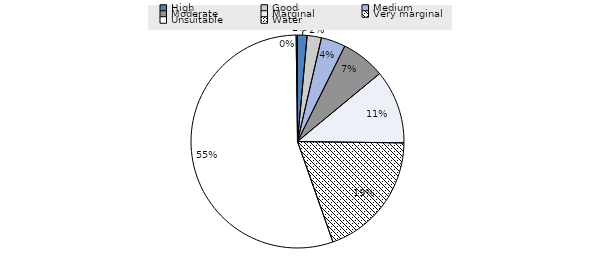
| Category | Series 0 |
|---|---|
| High | 1.422 |
| Good | 2.13 |
| Medium | 3.645 |
| Moderate | 6.566 |
| Marginal | 11.008 |
| Very marginal | 19.055 |
| Unsuitable | 54.226 |
| Water | 0.2 |